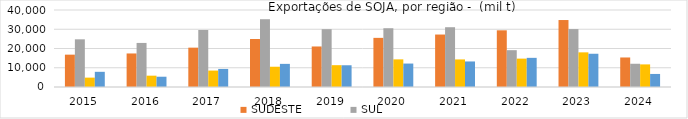
| Category | SUDESTE | SUL | NORTE | NORDESTE |
|---|---|---|---|---|
| 2015.0 | 16803.726 | 24766.136 | 4867.397 | 7886.974 |
| 2016.0 | 17420.76 | 22891.599 | 5882.904 | 5340.387 |
| 2017.0 | 20440.023 | 29614.782 | 8529.919 | 9386.021 |
| 2018.0 | 24921.654 | 35211.286 | 10528.549 | 12015.011 |
| 2019.0 | 21051.238 | 30035.114 | 11335.594 | 11292.631 |
| 2020.0 | 25524.654 | 30526.846 | 14353.507 | 12179.961 |
| 2021.0 | 27252.521 | 31051.227 | 14318.056 | 13267.949 |
| 2022.0 | 29444.378 | 19130.983 | 14737.599 | 15145.442 |
| 2023.0 | 34789.367 | 30084.315 | 17994.75 | 17269.391 |
| 2024.0 | 15336.071 | 12076.304 | 11744 | 6778.531 |